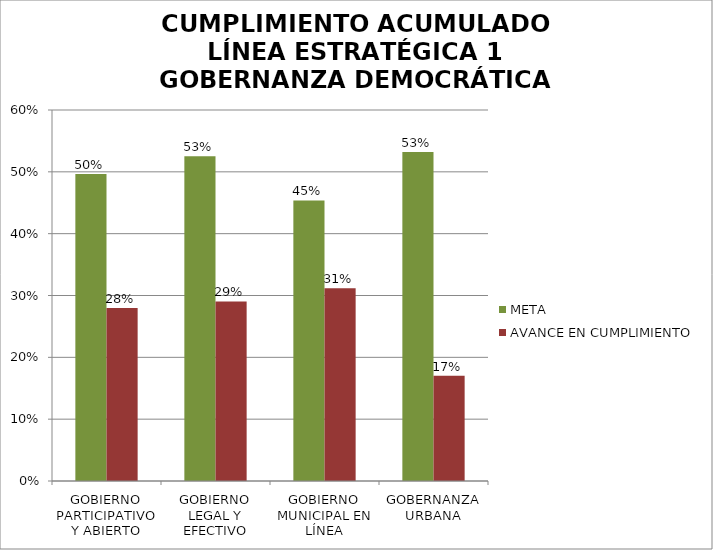
| Category | META | AVANCE EN CUMPLIMIENTO |
|---|---|---|
| GOBIERNO PARTICIPATIVO Y ABIERTO | 0.497 | 0.28 |
| GOBIERNO LEGAL Y EFECTIVO | 0.525 | 0.29 |
| GOBIERNO MUNICIPAL EN LÍNEA | 0.454 | 0.312 |
| GOBERNANZA URBANA | 0.532 | 0.17 |